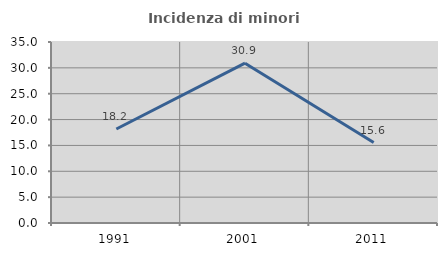
| Category | Incidenza di minori stranieri |
|---|---|
| 1991.0 | 18.182 |
| 2001.0 | 30.909 |
| 2011.0 | 15.556 |